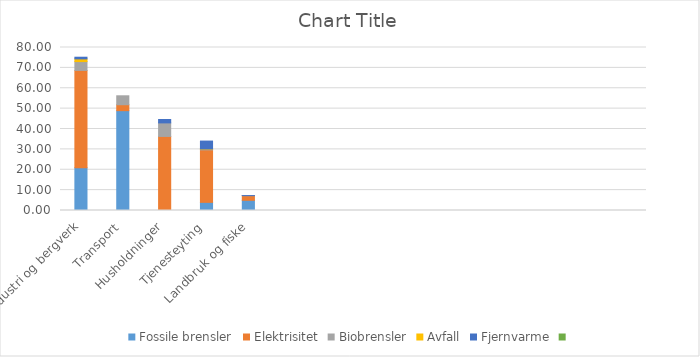
| Category | Fossile brensler | Elektrisitet | Biobrensler | Avfall | Fjernvarme | Series 5 |
|---|---|---|---|---|---|---|
| Industri og bergverk | 21 | 47.759 | 4.336 | 1.318 | 0.819 |  |
| Transport | 49 | 2.914 | 4.384 | 0 | 0 |  |
| Husholdninger | 0 | 36.348 | 6.653 | 0 | 1.652 |  |
| Tjenesteyting | 4 | 25.745 | 0.323 | 0.154 | 3.854 |  |
| Landbruk og fiske | 5 | 2.29 | 0.001 | 0 | 0.009 |  |